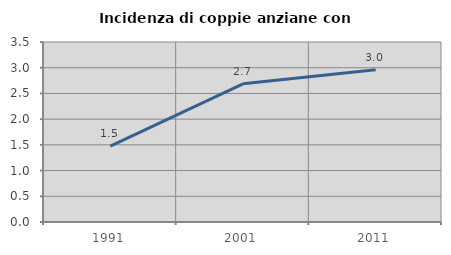
| Category | Incidenza di coppie anziane con figli |
|---|---|
| 1991.0 | 1.474 |
| 2001.0 | 2.686 |
| 2011.0 | 2.962 |